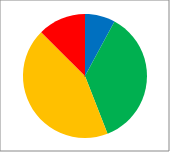
| Category | Count | % |
|---|---|---|
| Outstanding | 12 | 0.079 |
| Good | 55 | 0.362 |
| RI | 66 | 0.434 |
| Inadequate | 19 | 0.125 |